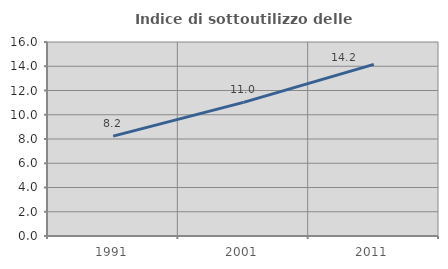
| Category | Indice di sottoutilizzo delle abitazioni  |
|---|---|
| 1991.0 | 8.237 |
| 2001.0 | 11.021 |
| 2011.0 | 14.159 |